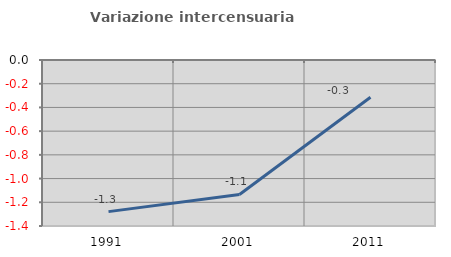
| Category | Variazione intercensuaria annua |
|---|---|
| 1991.0 | -1.279 |
| 2001.0 | -1.134 |
| 2011.0 | -0.314 |